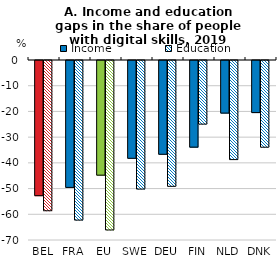
| Category | Income | Education |
|---|---|---|
| BEL | -52.564 | -58.427 |
| FRA | -49.351 | -62.069 |
| EU | -44.595 | -65.909 |
| SWE | -38.043 | -50 |
| DEU | -36.471 | -48.936 |
| FIN | -33.696 | -24.742 |
| NLD | -20.455 | -38.542 |
| DNK | -20.253 | -33.721 |